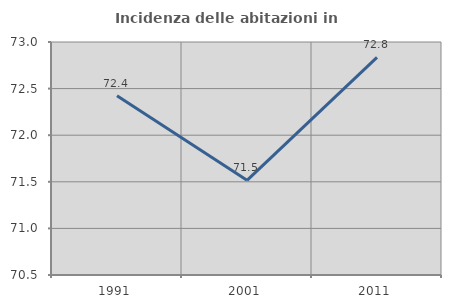
| Category | Incidenza delle abitazioni in proprietà  |
|---|---|
| 1991.0 | 72.422 |
| 2001.0 | 71.516 |
| 2011.0 | 72.834 |